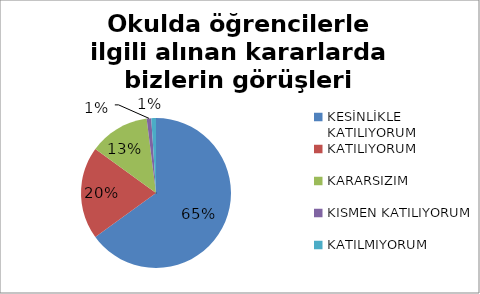
| Category | Okulda öğrencilerle ilgili alınan kararlarda bizlerin görüşleri alınır. |
|---|---|
| KESİNLİKLE KATILIYORUM | 130 |
| KATILIYORUM | 40 |
| KARARSIZIM | 26 |
| KISMEN KATILIYORUM | 2 |
| KATILMIYORUM | 2 |